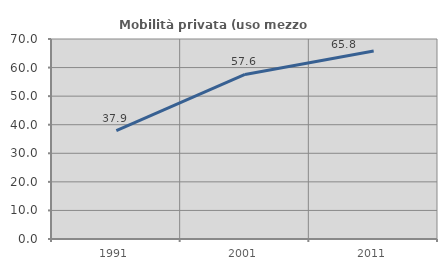
| Category | Mobilità privata (uso mezzo privato) |
|---|---|
| 1991.0 | 37.924 |
| 2001.0 | 57.603 |
| 2011.0 | 65.793 |